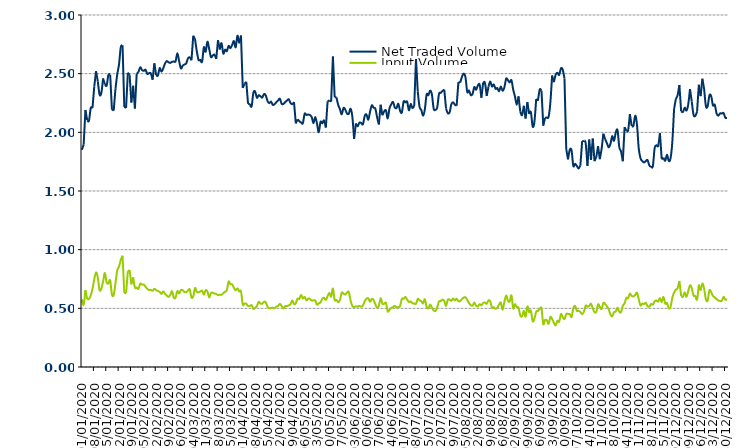
| Category | Net Traded Volume | Input Volume |
|---|---|---|
| 01/01/2020 | 1.852 | 0.576 |
| 02/01/2020 | 1.895 | 0.532 |
| 03/01/2020 | 2.191 | 0.656 |
| 04/01/2020 | 2.103 | 0.578 |
| 05/01/2020 | 2.099 | 0.58 |
| 06/01/2020 | 2.206 | 0.61 |
| 07/01/2020 | 2.208 | 0.666 |
| 08/01/2020 | 2.39 | 0.748 |
| 09/01/2020 | 2.521 | 0.806 |
| 10/01/2020 | 2.435 | 0.763 |
| 11/01/2020 | 2.322 | 0.656 |
| 12/01/2020 | 2.336 | 0.667 |
| 13/01/2020 | 2.459 | 0.729 |
| 14/01/2020 | 2.409 | 0.801 |
| 15/01/2020 | 2.399 | 0.722 |
| 16/01/2020 | 2.489 | 0.712 |
| 17/01/2020 | 2.491 | 0.739 |
| 18/01/2020 | 2.193 | 0.618 |
| 19/01/2020 | 2.186 | 0.614 |
| 20/01/2020 | 2.371 | 0.714 |
| 21/01/2020 | 2.495 | 0.823 |
| 22/01/2020 | 2.578 | 0.856 |
| 23/01/2020 | 2.725 | 0.912 |
| 24/01/2020 | 2.741 | 0.949 |
| 25/01/2020 | 2.217 | 0.631 |
| 26/01/2020 | 2.209 | 0.629 |
| 27/01/2020 | 2.508 | 0.816 |
| 28/01/2020 | 2.487 | 0.826 |
| 29/01/2020 | 2.255 | 0.704 |
| 30/01/2020 | 2.397 | 0.765 |
| 31/01/2020 | 2.203 | 0.677 |
| 01/02/2020 | 2.499 | 0.677 |
| 02/02/2020 | 2.513 | 0.667 |
| 03/02/2020 | 2.554 | 0.71 |
| 04/02/2020 | 2.532 | 0.703 |
| 05/02/2020 | 2.524 | 0.703 |
| 06/02/2020 | 2.534 | 0.683 |
| 07/02/2020 | 2.498 | 0.666 |
| 08/02/2020 | 2.504 | 0.656 |
| 09/02/2020 | 2.502 | 0.657 |
| 10/02/2020 | 2.449 | 0.65 |
| 11/02/2020 | 2.588 | 0.666 |
| 12/02/2020 | 2.487 | 0.655 |
| 13/02/2020 | 2.484 | 0.647 |
| 14/02/2020 | 2.547 | 0.641 |
| 15/02/2020 | 2.517 | 0.623 |
| 16/02/2020 | 2.544 | 0.644 |
| 17/02/2020 | 2.585 | 0.625 |
| 18/02/2020 | 2.607 | 0.609 |
| 19/02/2020 | 2.597 | 0.597 |
| 20/02/2020 | 2.592 | 0.615 |
| 21/02/2020 | 2.601 | 0.646 |
| 22/02/2020 | 2.603 | 0.59 |
| 23/02/2020 | 2.605 | 0.593 |
| 24/02/2020 | 2.674 | 0.647 |
| 25/02/2020 | 2.608 | 0.626 |
| 26/02/2020 | 2.545 | 0.656 |
| 27/02/2020 | 2.567 | 0.655 |
| 28/02/2020 | 2.578 | 0.639 |
| 29/02/2020 | 2.587 | 0.638 |
| 01/03/2020 | 2.63 | 0.651 |
| 02/03/2020 | 2.639 | 0.661 |
| 03/03/2020 | 2.614 | 0.593 |
| 04/03/2020 | 2.823 | 0.602 |
| 05/03/2020 | 2.794 | 0.673 |
| 06/03/2020 | 2.692 | 0.64 |
| 07/03/2020 | 2.617 | 0.638 |
| 08/03/2020 | 2.617 | 0.643 |
| 09/03/2020 | 2.602 | 0.65 |
| 10/03/2020 | 2.725 | 0.617 |
| 11/03/2020 | 2.687 | 0.654 |
| 12/03/2020 | 2.773 | 0.644 |
| 13/03/2020 | 2.712 | 0.593 |
| 14/03/2020 | 2.642 | 0.631 |
| 15/03/2020 | 2.654 | 0.632 |
| 16/03/2020 | 2.662 | 0.626 |
| 17/03/2020 | 2.626 | 0.623 |
| 18/03/2020 | 2.786 | 0.613 |
| 19/03/2020 | 2.706 | 0.616 |
| 20/03/2020 | 2.76 | 0.615 |
| 21/03/2020 | 2.671 | 0.629 |
| 22/03/2020 | 2.704 | 0.641 |
| 23/03/2020 | 2.692 | 0.655 |
| 24/03/2020 | 2.736 | 0.728 |
| 25/03/2020 | 2.717 | 0.705 |
| 26/03/2020 | 2.745 | 0.705 |
| 27/03/2020 | 2.778 | 0.675 |
| 28/03/2020 | 2.725 | 0.653 |
| 29/03/2020 | 2.824 | 0.67 |
| 30/03/2020 | 2.763 | 0.645 |
| 31/03/2020 | 2.825 | 0.646 |
| 01/04/2020 | 2.379 | 0.532 |
| 02/04/2020 | 2.414 | 0.541 |
| 03/04/2020 | 2.43 | 0.539 |
| 04/04/2020 | 2.243 | 0.52 |
| 05/04/2020 | 2.241 | 0.52 |
| 06/04/2020 | 2.221 | 0.527 |
| 07/04/2020 | 2.336 | 0.496 |
| 08/04/2020 | 2.348 | 0.504 |
| 09/04/2020 | 2.294 | 0.519 |
| 10/04/2020 | 2.316 | 0.555 |
| 11/04/2020 | 2.307 | 0.541 |
| 12/04/2020 | 2.296 | 0.54 |
| 13/04/2020 | 2.326 | 0.556 |
| 14/04/2020 | 2.315 | 0.553 |
| 15/04/2020 | 2.267 | 0.515 |
| 16/04/2020 | 2.249 | 0.5 |
| 17/04/2020 | 2.262 | 0.503 |
| 18/04/2020 | 2.234 | 0.505 |
| 19/04/2020 | 2.24 | 0.501 |
| 20/04/2020 | 2.257 | 0.514 |
| 21/04/2020 | 2.271 | 0.521 |
| 22/04/2020 | 2.286 | 0.538 |
| 23/04/2020 | 2.243 | 0.52 |
| 24/04/2020 | 2.242 | 0.5 |
| 25/04/2020 | 2.257 | 0.518 |
| 26/04/2020 | 2.27 | 0.519 |
| 27/04/2020 | 2.282 | 0.526 |
| 28/04/2020 | 2.251 | 0.534 |
| 29/04/2020 | 2.24 | 0.568 |
| 30/04/2020 | 2.257 | 0.536 |
| 01/05/2020 | 2.076 | 0.543 |
| 02/05/2020 | 2.11 | 0.582 |
| 03/05/2020 | 2.096 | 0.579 |
| 04/05/2020 | 2.084 | 0.615 |
| 05/05/2020 | 2.078 | 0.584 |
| 06/05/2020 | 2.158 | 0.597 |
| 07/05/2020 | 2.149 | 0.568 |
| 08/05/2020 | 2.151 | 0.583 |
| 09/05/2020 | 2.147 | 0.581 |
| 10/05/2020 | 2.131 | 0.567 |
| 11/05/2020 | 2.078 | 0.568 |
| 12/05/2020 | 2.13 | 0.567 |
| 13/05/2020 | 2.074 | 0.531 |
| 14/05/2020 | 2.001 | 0.543 |
| 15/05/2020 | 2.089 | 0.55 |
| 16/05/2020 | 2.078 | 0.581 |
| 17/05/2020 | 2.101 | 0.591 |
| 18/05/2020 | 2.041 | 0.571 |
| 19/05/2020 | 2.264 | 0.604 |
| 20/05/2020 | 2.273 | 0.631 |
| 21/05/2020 | 2.262 | 0.6 |
| 22/05/2020 | 2.646 | 0.669 |
| 23/05/2020 | 2.3 | 0.571 |
| 24/05/2020 | 2.298 | 0.571 |
| 25/05/2020 | 2.234 | 0.552 |
| 26/05/2020 | 2.196 | 0.572 |
| 27/05/2020 | 2.153 | 0.634 |
| 28/05/2020 | 2.207 | 0.624 |
| 29/05/2020 | 2.193 | 0.617 |
| 30/05/2020 | 2.159 | 0.636 |
| 31/05/2020 | 2.159 | 0.638 |
| 01/06/2020 | 2.201 | 0.567 |
| 02/06/2020 | 2.133 | 0.52 |
| 03/06/2020 | 1.944 | 0.511 |
| 04/06/2020 | 2.076 | 0.517 |
| 05/06/2020 | 2.051 | 0.513 |
| 06/06/2020 | 2.083 | 0.521 |
| 07/06/2020 | 2.08 | 0.513 |
| 08/06/2020 | 2.069 | 0.525 |
| 09/06/2020 | 2.14 | 0.56 |
| 10/06/2020 | 2.152 | 0.582 |
| 11/06/2020 | 2.108 | 0.586 |
| 12/06/2020 | 2.174 | 0.556 |
| 13/06/2020 | 2.23 | 0.58 |
| 14/06/2020 | 2.21 | 0.571 |
| 15/06/2020 | 2.202 | 0.535 |
| 16/06/2020 | 2.128 | 0.506 |
| 17/06/2020 | 2.067 | 0.523 |
| 18/06/2020 | 2.235 | 0.585 |
| 19/06/2020 | 2.146 | 0.54 |
| 20/06/2020 | 2.179 | 0.539 |
| 21/06/2020 | 2.187 | 0.546 |
| 22/06/2020 | 2.118 | 0.474 |
| 23/06/2020 | 2.204 | 0.487 |
| 24/06/2020 | 2.238 | 0.503 |
| 25/06/2020 | 2.259 | 0.51 |
| 26/06/2020 | 2.213 | 0.522 |
| 27/06/2020 | 2.207 | 0.506 |
| 28/06/2020 | 2.244 | 0.51 |
| 29/06/2020 | 2.183 | 0.52 |
| 30/06/2020 | 2.17 | 0.579 |
| 01/07/2020 | 2.262 | 0.581 |
| 02/07/2020 | 2.255 | 0.597 |
| 03/07/2020 | 2.261 | 0.574 |
| 04/07/2020 | 2.188 | 0.554 |
| 05/07/2020 | 2.241 | 0.559 |
| 06/07/2020 | 2.206 | 0.543 |
| 07/07/2020 | 2.225 | 0.541 |
| 08/07/2020 | 2.624 | 0.538 |
| 09/07/2020 | 2.348 | 0.58 |
| 10/07/2020 | 2.217 | 0.568 |
| 11/07/2020 | 2.191 | 0.56 |
| 12/07/2020 | 2.142 | 0.542 |
| 13/07/2020 | 2.195 | 0.578 |
| 14/07/2020 | 2.323 | 0.513 |
| 15/07/2020 | 2.316 | 0.501 |
| 16/07/2020 | 2.356 | 0.532 |
| 17/07/2020 | 2.322 | 0.507 |
| 18/07/2020 | 2.202 | 0.483 |
| 19/07/2020 | 2.192 | 0.477 |
| 20/07/2020 | 2.211 | 0.509 |
| 21/07/2020 | 2.326 | 0.558 |
| 22/07/2020 | 2.337 | 0.562 |
| 23/07/2020 | 2.352 | 0.575 |
| 24/07/2020 | 2.364 | 0.562 |
| 25/07/2020 | 2.203 | 0.521 |
| 26/07/2020 | 2.163 | 0.573 |
| 27/07/2020 | 2.17 | 0.574 |
| 28/07/2020 | 2.239 | 0.565 |
| 29/07/2020 | 2.256 | 0.584 |
| 30/07/2020 | 2.235 | 0.567 |
| 31/07/2020 | 2.228 | 0.582 |
| 01/08/2020 | 2.428 | 0.561 |
| 02/08/2020 | 2.423 | 0.561 |
| 03/08/2020 | 2.473 | 0.579 |
| 04/08/2020 | 2.501 | 0.591 |
| 05/08/2020 | 2.469 | 0.595 |
| 06/08/2020 | 2.344 | 0.572 |
| 07/08/2020 | 2.356 | 0.545 |
| 08/08/2020 | 2.318 | 0.527 |
| 09/08/2020 | 2.328 | 0.523 |
| 10/08/2020 | 2.386 | 0.55 |
| 11/08/2020 | 2.363 | 0.522 |
| 12/08/2020 | 2.399 | 0.517 |
| 13/08/2020 | 2.406 | 0.535 |
| 14/08/2020 | 2.295 | 0.525 |
| 15/08/2020 | 2.425 | 0.545 |
| 16/08/2020 | 2.422 | 0.55 |
| 17/08/2020 | 2.31 | 0.539 |
| 18/08/2020 | 2.389 | 0.568 |
| 19/08/2020 | 2.434 | 0.559 |
| 20/08/2020 | 2.39 | 0.506 |
| 21/08/2020 | 2.408 | 0.509 |
| 22/08/2020 | 2.371 | 0.496 |
| 23/08/2020 | 2.377 | 0.504 |
| 24/08/2020 | 2.351 | 0.532 |
| 25/08/2020 | 2.391 | 0.548 |
| 26/08/2020 | 2.354 | 0.488 |
| 27/08/2020 | 2.383 | 0.555 |
| 28/08/2020 | 2.458 | 0.609 |
| 29/08/2020 | 2.444 | 0.565 |
| 30/08/2020 | 2.425 | 0.559 |
| 31/08/2020 | 2.444 | 0.611 |
| 01/09/2020 | 2.363 | 0.5 |
| 02/09/2020 | 2.305 | 0.536 |
| 03/09/2020 | 2.235 | 0.512 |
| 04/09/2020 | 2.307 | 0.505 |
| 05/09/2020 | 2.175 | 0.438 |
| 06/09/2020 | 2.147 | 0.433 |
| 07/09/2020 | 2.226 | 0.479 |
| 08/09/2020 | 2.118 | 0.429 |
| 09/09/2020 | 2.257 | 0.517 |
| 10/09/2020 | 2.158 | 0.467 |
| 11/09/2020 | 2.173 | 0.481 |
| 12/09/2020 | 2.05 | 0.39 |
| 13/09/2020 | 2.092 | 0.412 |
| 14/09/2020 | 2.283 | 0.472 |
| 15/09/2020 | 2.27 | 0.478 |
| 16/09/2020 | 2.365 | 0.495 |
| 17/09/2020 | 2.354 | 0.499 |
| 18/09/2020 | 2.057 | 0.366 |
| 19/09/2020 | 2.123 | 0.401 |
| 20/09/2020 | 2.126 | 0.398 |
| 21/09/2020 | 2.132 | 0.368 |
| 22/09/2020 | 2.252 | 0.427 |
| 23/09/2020 | 2.484 | 0.409 |
| 24/09/2020 | 2.428 | 0.378 |
| 25/09/2020 | 2.49 | 0.355 |
| 26/09/2020 | 2.509 | 0.394 |
| 27/09/2020 | 2.489 | 0.386 |
| 28/09/2020 | 2.545 | 0.451 |
| 29/09/2020 | 2.534 | 0.425 |
| 30/09/2020 | 2.459 | 0.41 |
| 01/10/2020 | 1.857 | 0.452 |
| 02/10/2020 | 1.77 | 0.452 |
| 03/10/2020 | 1.852 | 0.45 |
| 04/10/2020 | 1.846 | 0.426 |
| 05/10/2020 | 1.714 | 0.5 |
| 06/10/2020 | 1.732 | 0.521 |
| 07/10/2020 | 1.714 | 0.479 |
| 08/10/2020 | 1.691 | 0.479 |
| 09/10/2020 | 1.72 | 0.469 |
| 10/10/2020 | 1.925 | 0.452 |
| 11/10/2020 | 1.926 | 0.471 |
| 12/10/2020 | 1.906 | 0.523 |
| 13/10/2020 | 1.714 | 0.514 |
| 14/10/2020 | 1.938 | 0.52 |
| 15/10/2020 | 1.764 | 0.539 |
| 16/10/2020 | 1.947 | 0.5 |
| 17/10/2020 | 1.755 | 0.467 |
| 18/10/2020 | 1.789 | 0.471 |
| 19/10/2020 | 1.882 | 0.534 |
| 20/10/2020 | 1.771 | 0.513 |
| 21/10/2020 | 1.858 | 0.494 |
| 22/10/2020 | 1.989 | 0.546 |
| 23/10/2020 | 1.942 | 0.536 |
| 24/10/2020 | 1.908 | 0.517 |
| 25/10/2020 | 1.871 | 0.493 |
| 26/10/2020 | 1.902 | 0.448 |
| 27/10/2020 | 1.968 | 0.433 |
| 28/10/2020 | 1.927 | 0.466 |
| 29/10/2020 | 1.996 | 0.474 |
| 30/10/2020 | 2.018 | 0.507 |
| 31/10/2020 | 1.874 | 0.471 |
| 01/11/2020 | 1.836 | 0.468 |
| 02/11/2020 | 1.754 | 0.522 |
| 03/11/2020 | 2.044 | 0.543 |
| 04/11/2020 | 2.014 | 0.588 |
| 05/11/2020 | 2.017 | 0.587 |
| 06/11/2020 | 2.155 | 0.625 |
| 07/11/2020 | 2.054 | 0.605 |
| 08/11/2020 | 2.056 | 0.602 |
| 09/11/2020 | 2.142 | 0.614 |
| 10/11/2020 | 2.067 | 0.633 |
| 11/11/2020 | 1.864 | 0.579 |
| 12/11/2020 | 1.779 | 0.524 |
| 13/11/2020 | 1.755 | 0.541 |
| 14/11/2020 | 1.743 | 0.537 |
| 15/11/2020 | 1.755 | 0.548 |
| 16/11/2020 | 1.763 | 0.518 |
| 17/11/2020 | 1.718 | 0.515 |
| 18/11/2020 | 1.707 | 0.537 |
| 19/11/2020 | 1.713 | 0.531 |
| 20/11/2020 | 1.865 | 0.56 |
| 21/11/2020 | 1.889 | 0.567 |
| 22/11/2020 | 1.885 | 0.558 |
| 23/11/2020 | 1.993 | 0.588 |
| 24/11/2020 | 1.771 | 0.554 |
| 25/11/2020 | 1.784 | 0.597 |
| 26/11/2020 | 1.758 | 0.54 |
| 27/11/2020 | 1.809 | 0.545 |
| 28/11/2020 | 1.756 | 0.501 |
| 29/11/2020 | 1.779 | 0.511 |
| 30/11/2020 | 1.918 | 0.59 |
| 01/12/2020 | 2.2 | 0.634 |
| 02/12/2020 | 2.285 | 0.659 |
| 03/12/2020 | 2.317 | 0.672 |
| 04/12/2020 | 2.404 | 0.733 |
| 05/12/2020 | 2.179 | 0.605 |
| 06/12/2020 | 2.169 | 0.598 |
| 07/12/2020 | 2.21 | 0.637 |
| 08/12/2020 | 2.186 | 0.598 |
| 09/12/2020 | 2.237 | 0.647 |
| 10/12/2020 | 2.369 | 0.695 |
| 11/12/2020 | 2.263 | 0.671 |
| 12/12/2020 | 2.15 | 0.609 |
| 13/12/2020 | 2.14 | 0.605 |
| 14/12/2020 | 2.176 | 0.576 |
| 15/12/2020 | 2.406 | 0.702 |
| 16/12/2020 | 2.309 | 0.651 |
| 17/12/2020 | 2.457 | 0.712 |
| 18/12/2020 | 2.369 | 0.666 |
| 19/12/2020 | 2.223 | 0.576 |
| 20/12/2020 | 2.223 | 0.567 |
| 21/12/2020 | 2.316 | 0.654 |
| 22/12/2020 | 2.308 | 0.637 |
| 23/12/2020 | 2.229 | 0.605 |
| 24/12/2020 | 2.236 | 0.593 |
| 25/12/2020 | 2.163 | 0.579 |
| 26/12/2020 | 2.141 | 0.567 |
| 27/12/2020 | 2.162 | 0.563 |
| 28/12/2020 | 2.16 | 0.564 |
| 29/12/2020 | 2.165 | 0.598 |
| 30/12/2020 | 2.124 | 0.575 |
| 31/12/2020 | 2.124 | 0.575 |